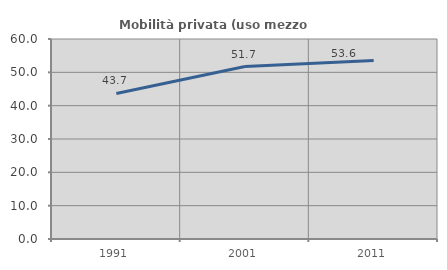
| Category | Mobilità privata (uso mezzo privato) |
|---|---|
| 1991.0 | 43.651 |
| 2001.0 | 51.724 |
| 2011.0 | 53.571 |